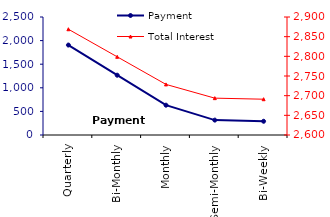
| Category | Payment |
|---|---|
| Quarterly | 1905.74 |
| Bi-Monthly | 1266.6 |
| Monthly | 631.35 |
| Semi-Monthly | 315.19 |
| Bi-Weekly | 290.91 |